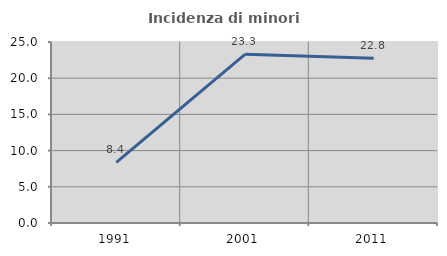
| Category | Incidenza di minori stranieri |
|---|---|
| 1991.0 | 8.368 |
| 2001.0 | 23.3 |
| 2011.0 | 22.751 |